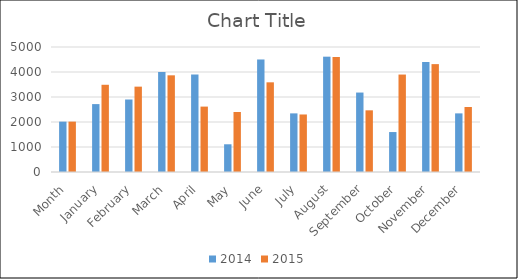
| Category | 2014 | 2015 |
|---|---|---|
| Month | 2014 | 2015 |
| January | 2716 | 3489 |
| February | 2900 | 3414 |
| March | 4000 | 3867 |
| April | 3900 | 2616 |
| May | 1109 | 2400 |
| June | 4501 | 3587 |
| July | 2345 | 2301 |
| August | 4613 | 4600 |
| September | 3178 | 2467 |
| October | 1598 | 3898 |
| November | 4400 | 4315 |
| December | 2345 | 2600 |